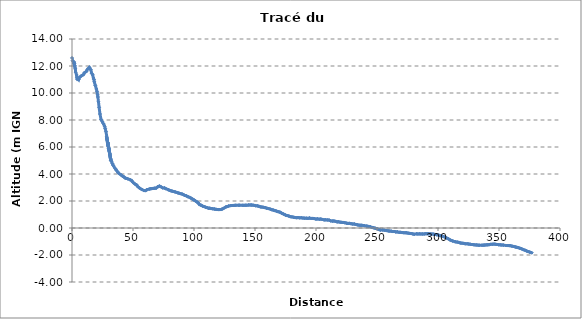
| Category | Series 0 |
|---|---|
| 0.0 | 12.594 |
| 0.4582193801113169 | 12.389 |
| 2.188933074072929 | 12.02 |
| 1.9385608068473883 | 12.171 |
| 1.6045715940986895 | 12.3 |
| 2.7287814137242075 | 11.786 |
| 2.972425441360707 | 11.547 |
| 3.7638589241327027 | 11.338 |
| 4.427291723680784 | 10.994 |
| 4.184619576677869 | 11.133 |
| 5.486662009010861 | 10.991 |
| 6.015513611022579 | 11.143 |
| 7.569549590604947 | 11.264 |
| 9.29045660920533 | 11.356 |
| 10.25053291326372 | 11.505 |
| 11.740522050269174 | 11.594 |
| 12.657856375310068 | 11.749 |
| 14.242805376754662 | 11.894 |
| 15.391503175698572 | 11.723 |
| 16.19988311708965 | 11.457 |
| 16.934883761687882 | 11.346 |
| 17.548827454331906 | 11.111 |
| 17.989313188841113 | 11.006 |
| 18.286976814051055 | 10.826 |
| 19.10421534690403 | 10.562 |
| 19.988952374437375 | 10.294 |
| 20.510405871522817 | 10.104 |
| 20.98067401221843 | 9.869 |
| 21.217493749561367 | 9.707 |
| 21.697015578309177 | 9.344 |
| 22.227295742442973 | 8.939 |
| 22.927444384914164 | 8.446 |
| 23.81363855021895 | 8.042 |
| 24.882161964652934 | 7.869 |
| 25.724510588278964 | 7.722 |
| 26.770220170971918 | 7.54 |
| 27.227224501020853 | 7.354 |
| 27.860125072038805 | 7.138 |
| 30.0680540281314 | 5.889 |
| 28.33499477675762 | 6.747 |
| 31.83635571225422 | 5.014 |
| 29.26099417377932 | 6.353 |
| 31.059015648161665 | 5.479 |
| 31.611136930388138 | 5.165 |
| 32.304239628987844 | 4.941 |
| 33.09588840058497 | 4.764 |
| 33.7788433792402 | 4.636 |
| 35.43562226066894 | 4.403 |
| 36.395009163918424 | 4.28 |
| 37.358570690149115 | 4.16 |
| 38.30423690710727 | 4.054 |
| 40.404438395372374 | 3.918 |
| 41.48363542443239 | 3.836 |
| 42.58070202610344 | 3.786 |
| 43.596190705576994 | 3.701 |
| 44.63727215078727 | 3.67 |
| 45.66838541078601 | 3.646 |
| 47.59293905651198 | 3.573 |
| 48.73594913406225 | 3.525 |
| 49.907493465369065 | 3.388 |
| 51.65526812501662 | 3.256 |
| 52.92178842425919 | 3.194 |
| 53.91072755962517 | 3.067 |
| 55.252471872924055 | 2.969 |
| 57.212168749920565 | 2.854 |
| 59.1687097797317 | 2.774 |
| 60.24236599830502 | 2.769 |
| 61.36051131696469 | 2.834 |
| 63.40279051507038 | 2.886 |
| 64.49241336003115 | 2.907 |
| 65.62592476314329 | 2.922 |
| 66.68546732247162 | 2.933 |
| 67.81860677631279 | 2.946 |
| 68.9245411236474 | 2.952 |
| 70.47882518963154 | 3.067 |
| 71.65225279094113 | 3.105 |
| 72.71457060386578 | 3.064 |
| 74.32474668023872 | 2.974 |
| 75.80975191246901 | 2.966 |
| 76.94519021415229 | 2.912 |
| 78.83045303090351 | 2.842 |
| 79.84889730655662 | 2.791 |
| 80.95450896027585 | 2.761 |
| 81.99674925287432 | 2.733 |
| 83.1427406820547 | 2.704 |
| 84.42883823106747 | 2.677 |
| 85.66619856782594 | 2.635 |
| 86.86664023101568 | 2.603 |
| 87.91372259854312 | 2.572 |
| 88.96320698503722 | 2.546 |
| 90.19545470863709 | 2.517 |
| 91.38327180123805 | 2.474 |
| 92.51917705046891 | 2.407 |
| 93.81283607338233 | 2.377 |
| 95.02596988228959 | 2.319 |
| 96.37293749334071 | 2.268 |
| 97.60906060989795 | 2.206 |
| 98.8141440538411 | 2.141 |
| 99.98925050231958 | 2.076 |
| 101.22843427146206 | 2.003 |
| 102.49625691261154 | 1.929 |
| 103.60385854779992 | 1.843 |
| 104.50154870675198 | 1.734 |
| 105.67784805768417 | 1.691 |
| 107.02352512436977 | 1.626 |
| 108.25609108954015 | 1.59 |
| 109.43413899769303 | 1.54 |
| 110.50560742811982 | 1.516 |
| 111.7890053367114 | 1.466 |
| 112.86702916763188 | 1.467 |
| 114.22304685605229 | 1.439 |
| 115.43402189175274 | 1.424 |
| 116.75635005035662 | 1.404 |
| 117.96903811236805 | 1.386 |
| 119.29446804095346 | 1.367 |
| 120.43083429923836 | 1.362 |
| 121.83000105082822 | 1.368 |
| 122.91294433452644 | 1.394 |
| 124.1355977032371 | 1.449 |
| 126.20287318514788 | 1.564 |
| 127.19559802576406 | 1.588 |
| 128.4426870202638 | 1.629 |
| 130.18297133717923 | 1.661 |
| 132.1299281958754 | 1.669 |
| 133.18065281801515 | 1.676 |
| 134.31500352968487 | 1.68 |
| 136.42860638852042 | 1.685 |
| 137.4968896520782 | 1.686 |
| 139.61390399622263 | 1.68 |
| 140.91206683614706 | 1.676 |
| 142.185078897223 | 1.687 |
| 143.34118951708788 | 1.684 |
| 144.81914375224045 | 1.705 |
| 146.00915217913294 | 1.703 |
| 147.17643227434033 | 1.701 |
| 148.3413693412535 | 1.691 |
| 149.61678190968226 | 1.672 |
| 150.67251889166926 | 1.648 |
| 152.0530190694426 | 1.639 |
| 153.12703291743287 | 1.608 |
| 154.45573013062102 | 1.567 |
| 155.65355766274192 | 1.554 |
| 156.93198462127782 | 1.533 |
| 158.34133864852376 | 1.507 |
| 159.63905514957014 | 1.465 |
| 161.17869362912623 | 1.439 |
| 162.66022688146566 | 1.392 |
| 163.98362512458357 | 1.348 |
| 165.18520902336408 | 1.323 |
| 166.46962962950246 | 1.287 |
| 167.6396099167213 | 1.25 |
| 169.03589105885038 | 1.207 |
| 170.32540818447455 | 1.18 |
| 171.71934410621455 | 1.106 |
| 172.79266771512792 | 1.065 |
| 173.99681874104752 | 1.003 |
| 174.9970310893878 | 0.957 |
| 176.2817283385051 | 0.922 |
| 177.68153187395328 | 0.888 |
| 179.07091290341694 | 0.839 |
| 180.32947227008918 | 0.821 |
| 181.69646644895153 | 0.797 |
| 182.9860808914841 | 0.772 |
| 184.18069413755995 | 0.764 |
| 185.37699711695706 | 0.773 |
| 186.7208317515605 | 0.751 |
| 188.07055399816952 | 0.758 |
| 189.39769104498475 | 0.735 |
| 190.708278050525 | 0.729 |
| 192.01559529434263 | 0.728 |
| 193.40346128568288 | 0.711 |
| 194.59478392292317 | 0.738 |
| 195.98396546678936 | 0.71 |
| 197.21573949393184 | 0.712 |
| 198.55414111552648 | 0.699 |
| 200.02691223484692 | 0.66 |
| 201.17522061386214 | 0.679 |
| 202.60369636630614 | 0.654 |
| 203.96897172429456 | 0.66 |
| 205.26994087076292 | 0.632 |
| 206.68426736508118 | 0.601 |
| 207.87340159871394 | 0.605 |
| 209.2415127937541 | 0.596 |
| 210.67177983062876 | 0.59 |
| 212.0962052590245 | 0.529 |
| 213.50048511675962 | 0.512 |
| 214.66800640365295 | 0.52 |
| 215.95998307384193 | 0.492 |
| 217.3496862781385 | 0.453 |
| 218.4642811083736 | 0.462 |
| 219.79295946906194 | 0.429 |
| 221.08874824408687 | 0.417 |
| 222.32668108276158 | 0.411 |
| 223.64794749843293 | 0.393 |
| 225.00928306442032 | 0.357 |
| 226.1880628882571 | 0.34 |
| 227.4265927922835 | 0.344 |
| 228.81070968155683 | 0.317 |
| 230.17670261168448 | 0.296 |
| 231.36281499026612 | 0.297 |
| 232.64737579879173 | 0.261 |
| 233.96892617008734 | 0.234 |
| 235.26073965926022 | 0.212 |
| 236.489195426251 | 0.202 |
| 237.49613612076118 | 0.201 |
| 239.57322421775407 | 0.174 |
| 241.69943022284528 | 0.144 |
| 243.09260971963533 | 0.114 |
| 244.55039133346034 | 0.089 |
| 246.0045399662824 | 0.039 |
| 247.21510825429021 | 0.019 |
| 248.4343435780091 | -0.014 |
| 249.46543885946926 | -0.037 |
| 250.51751755524984 | -0.069 |
| 251.72423946315772 | -0.117 |
| 252.79760395479067 | -0.154 |
| 254.75015521305306 | -0.146 |
| 256.06505646070525 | -0.164 |
| 257.99955036419027 | -0.193 |
| 259.2390012196134 | -0.216 |
| 260.48377454690393 | -0.226 |
| 261.66830746264367 | -0.237 |
| 262.9595697765114 | -0.262 |
| 264.24776634453286 | -0.258 |
| 265.48337463072306 | -0.29 |
| 266.7193094946914 | -0.284 |
| 268.14277547977724 | -0.322 |
| 269.420400039042 | -0.322 |
| 270.6715262109167 | -0.339 |
| 271.73152098353546 | -0.345 |
| 273.0193944411467 | -0.35 |
| 274.23360075011084 | -0.356 |
| 275.4860867921152 | -0.381 |
| 276.76237373236904 | -0.4 |
| 277.9422561780855 | -0.409 |
| 279.3858673186558 | -0.437 |
| 280.457257009428 | -0.464 |
| 282.3606275992694 | -0.431 |
| 283.53496870289325 | -0.439 |
| 284.84546491261904 | -0.434 |
| 286.04896567032324 | -0.441 |
| 287.4057130836132 | -0.44 |
| 288.6818816246062 | -0.442 |
| 289.8128919494872 | -0.422 |
| 290.989197086852 | -0.423 |
| 292.18819301336356 | -0.427 |
| 293.66146156615923 | -0.437 |
| 295.0278567525315 | -0.447 |
| 296.3393755888158 | -0.457 |
| 297.75056729480065 | -0.479 |
| 299.02959952711075 | -0.5 |
| 300.43887310562855 | -0.524 |
| 301.79856728191504 | -0.562 |
| 303.1088002704739 | -0.597 |
| 304.3639359738405 | -0.634 |
| 305.7266125486135 | -0.68 |
| 307.0890079071668 | -0.74 |
| 308.44417912033936 | -0.795 |
| 309.8677060254858 | -0.882 |
| 311.10133391249923 | -0.93 |
| 312.16359347034705 | -0.968 |
| 314.19180897230973 | -1.021 |
| 315.6336462706332 | -1.041 |
| 316.9736481118013 | -1.065 |
| 318.27899596011684 | -1.108 |
| 319.65747139281046 | -1.125 |
| 321.0704102863685 | -1.139 |
| 322.29917972359146 | -1.166 |
| 323.86940688641937 | -1.171 |
| 325.2147813697468 | -1.185 |
| 326.50805801110903 | -1.208 |
| 327.7197293304793 | -1.223 |
| 328.99143295873097 | -1.233 |
| 330.32221510846813 | -1.25 |
| 331.7343330094619 | -1.254 |
| 332.89585041895924 | -1.272 |
| 333.96289832852005 | -1.275 |
| 336.05950886265884 | -1.273 |
| 337.1155567459059 | -1.27 |
| 338.2865000234066 | -1.263 |
| 339.4285972073507 | -1.25 |
| 340.572475253221 | -1.245 |
| 341.8128087790674 | -1.235 |
| 343.1577728585135 | -1.211 |
| 344.57680300929763 | -1.203 |
| 345.95637969315175 | -1.191 |
| 347.2141550834748 | -1.207 |
| 348.49092240852616 | -1.223 |
| 349.9094288260371 | -1.24 |
| 351.0660443241568 | -1.247 |
| 352.38549154305025 | -1.26 |
| 353.59716279606863 | -1.268 |
| 355.7495058006264 | -1.297 |
| 357.0726416296711 | -1.3 |
| 358.3463558769275 | -1.305 |
| 359.3526577459104 | -1.308 |
| 360.68661179631744 | -1.347 |
| 362.03235711819576 | -1.367 |
| 363.4076118803483 | -1.404 |
| 364.4805166883438 | -1.427 |
| 365.68874595834893 | -1.454 |
| 367.02721755963455 | -1.495 |
| 368.58296165389925 | -1.543 |
| 370.0516755772128 | -1.604 |
| 371.3457805670899 | -1.65 |
| 372.68562417282266 | -1.702 |
| 374.0201285291589 | -1.747 |
| 375.2494826449035 | -1.787 |
| 376.8551072150496 | -1.834 |